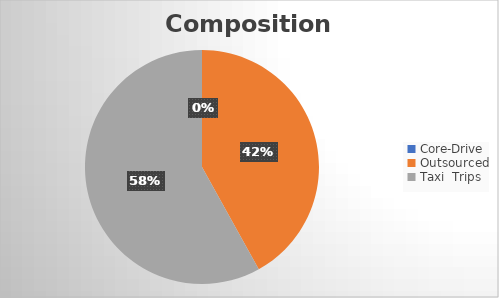
| Category | Fleet |
|---|---|
| Core-Drive | 0 |
| Outsourced | 13 |
| Taxi  Trips | 18 |